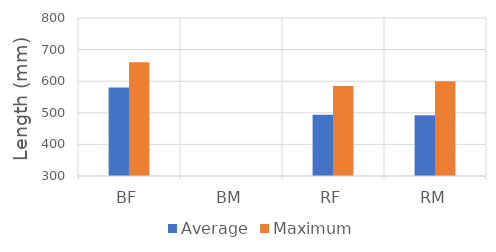
| Category | Average | Maximum |
|---|---|---|
| BF | 580 | 660 |
| BM | 0 | 0 |
| RF | 494 | 585 |
| RM | 492 | 600 |